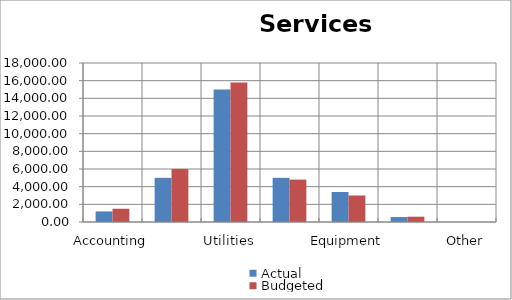
| Category | Actual | Budgeted |
|---|---|---|
| Accounting | 1200 | 1500 |
| Legal | 5000 | 6000 |
| Utilities | 15000 | 15789 |
| Telephone | 5000 | 4800 |
| Equipment | 3400 | 3000 |
| Rentals | 560 | 600 |
| Other | 0 | 0 |